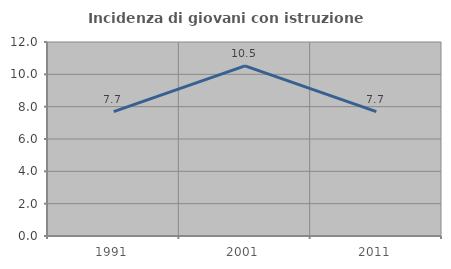
| Category | Incidenza di giovani con istruzione universitaria |
|---|---|
| 1991.0 | 7.692 |
| 2001.0 | 10.526 |
| 2011.0 | 7.692 |